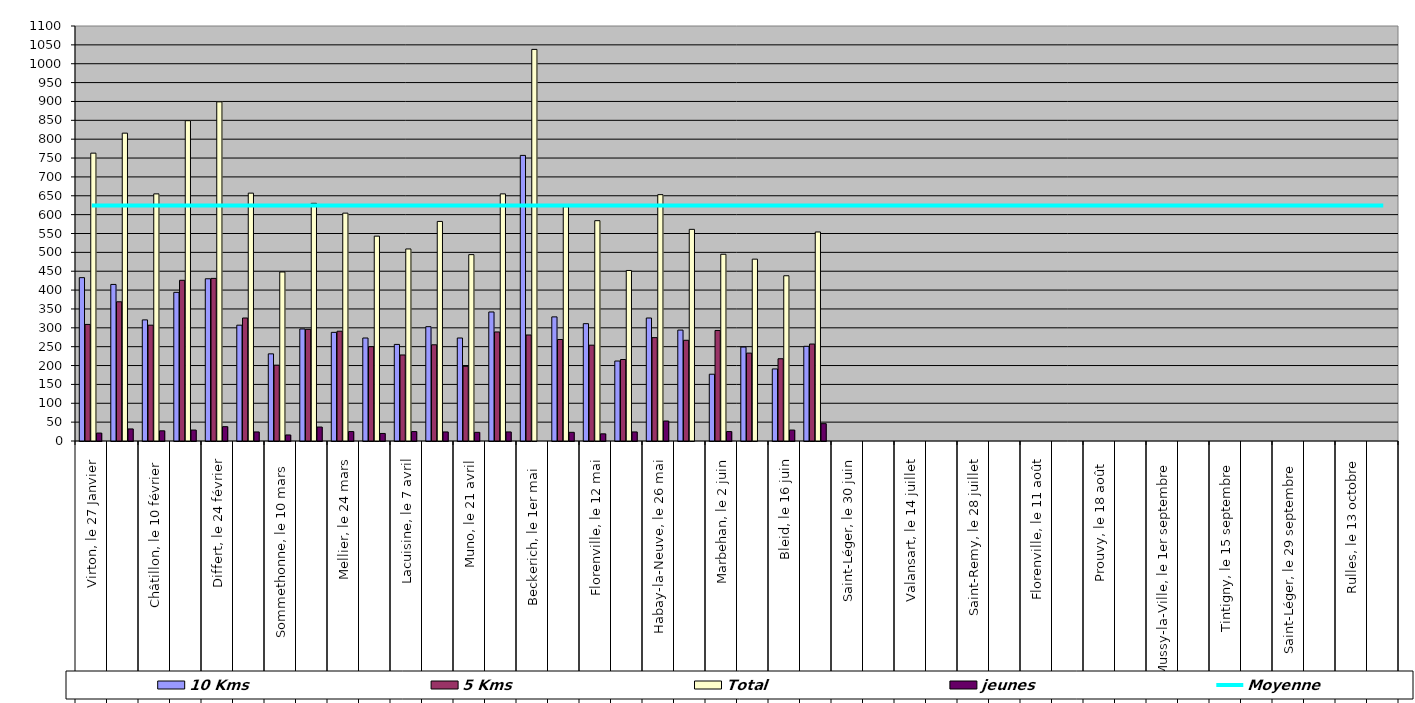
| Category | 10 Kms | 5 Kms | Total | jeunes |
|---|---|---|---|---|
| 0 | 433 | 309 | 763 | 21 |
| 1 | 415 | 369 | 816 | 32 |
| 2 | 321 | 307 | 655 | 27 |
| 3 | 394 | 426 | 849 | 29 |
| 4 | 430 | 431 | 899 | 38 |
| 5 | 307 | 326 | 657 | 24 |
| 6 | 231 | 201 | 448 | 16 |
| 7 | 297 | 296 | 630 | 37 |
| 8 | 288 | 291 | 604 | 25 |
| 9 | 273 | 250 | 543 | 20 |
| 10 | 256 | 228 | 509 | 25 |
| 11 | 303 | 255 | 582 | 24 |
| 12 | 273 | 198 | 494 | 23 |
| 13 | 342 | 289 | 655 | 24 |
| 14 | 757 | 281 | 1038 | 0 |
| 15 | 329 | 269 | 621 | 23 |
| 16 | 311 | 254 | 584 | 19 |
| 17 | 212 | 216 | 452 | 24 |
| 18 | 326 | 274 | 653 | 53 |
| 19 | 294 | 267 | 561 | 0 |
| 20 | 177 | 293 | 495 | 25 |
| 21 | 249 | 233 | 482 | 0 |
| 22 | 191 | 218 | 438 | 29 |
| 23 | 251 | 257 | 554 | 46 |
| 24 | 0 | 0 | 0 | 0 |
| 25 | 0 | 0 | 0 | 0 |
| 26 | 0 | 0 | 0 | 0 |
| 27 | 0 | 0 | 0 | 0 |
| 28 | 0 | 0 | 0 | 0 |
| 29 | 0 | 0 | 0 | 0 |
| 30 | 0 | 0 | 0 | 0 |
| 31 | 0 | 0 | 0 | 0 |
| 32 | 0 | 0 | 0 | 0 |
| 33 | 0 | 0 | 0 | 0 |
| 34 | 0 | 0 | 0 | 0 |
| 35 | 0 | 0 | 0 | 0 |
| 36 | 0 | 0 | 0 | 0 |
| 37 | 0 | 0 | 0 | 0 |
| 38 | 0 | 0 | 0 | 0 |
| 39 | 0 | 0 | 0 | 0 |
| 40 | 0 | 0 | 0 | 0 |
| 41 | 0 | 0 | 0 | 0 |